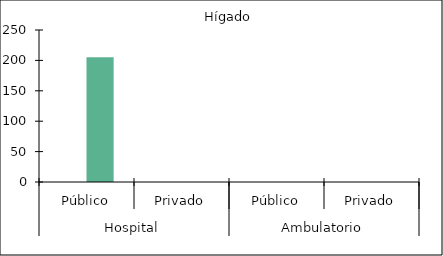
| Category |   |    Hígado |
|---|---|---|
| 0 | 0 | 205 |
| 1 | 0 | 0 |
| 2 | 0 | 0 |
| 3 | 0 | 0 |